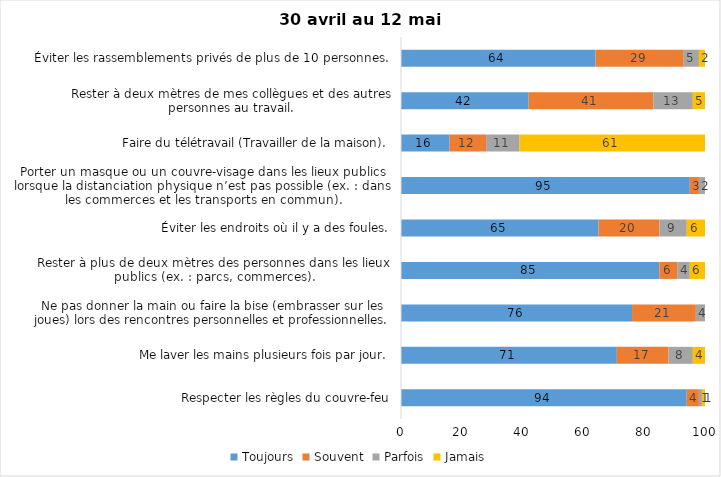
| Category | Toujours | Souvent | Parfois | Jamais |
|---|---|---|---|---|
| Respecter les règles du couvre-feu | 94 | 4 | 1 | 1 |
| Me laver les mains plusieurs fois par jour. | 71 | 17 | 8 | 4 |
| Ne pas donner la main ou faire la bise (embrasser sur les joues) lors des rencontres personnelles et professionnelles. | 76 | 21 | 4 | 0 |
| Rester à plus de deux mètres des personnes dans les lieux publics (ex. : parcs, commerces). | 85 | 6 | 4 | 6 |
| Éviter les endroits où il y a des foules. | 65 | 20 | 9 | 6 |
| Porter un masque ou un couvre-visage dans les lieux publics lorsque la distanciation physique n’est pas possible (ex. : dans les commerces et les transports en commun). | 95 | 3 | 2 | 0 |
| Faire du télétravail (Travailler de la maison). | 16 | 12 | 11 | 61 |
| Rester à deux mètres de mes collègues et des autres personnes au travail. | 42 | 41 | 13 | 5 |
| Éviter les rassemblements privés de plus de 10 personnes. | 64 | 29 | 5 | 2 |